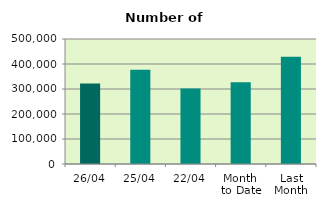
| Category | Series 0 |
|---|---|
| 26/04 | 322412 |
| 25/04 | 377446 |
| 22/04 | 302390 |
| Month 
to Date | 326715.333 |
| Last
Month | 428970.609 |